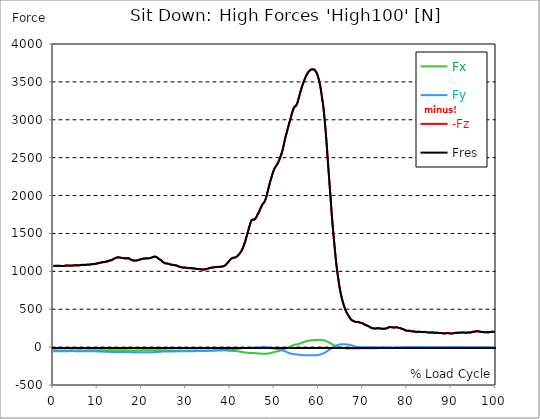
| Category |  Fx |  Fy |  -Fz |  Fres |
|---|---|---|---|---|
| 0.0 | -42.842 | -54.242 | 1071.949 | 1074.218 |
| 0.167348456675344 | -42.973 | -54.182 | 1071.723 | 1073.979 |
| 0.334696913350688 | -42.902 | -54.159 | 1071.03 | 1073.286 |
| 0.5020453700260321 | -42.735 | -54.099 | 1070.553 | 1072.797 |
| 0.669393826701376 | -42.389 | -54.003 | 1070.493 | 1072.725 |
| 0.83674228337672 | -42.902 | -53.765 | 1072.2 | 1074.432 |
| 1.0040907400520642 | -43.594 | -53.908 | 1072.546 | 1074.814 |
| 1.1621420602454444 | -43.188 | -54.194 | 1070.887 | 1073.167 |
| 1.3294905169207885 | -43.367 | -54.23 | 1070.35 | 1072.63 |
| 1.4968389735961325 | -43.415 | -54.051 | 1070.171 | 1072.451 |
| 1.6641874302714765 | -43.463 | -54.075 | 1070.242 | 1072.511 |
| 1.8315358869468206 | -43.451 | -54.361 | 1070.004 | 1072.296 |
| 1.9988843436221646 | -43.153 | -54.648 | 1068.738 | 1071.03 |
| 2.1662328002975086 | -43.069 | -54.445 | 1068.774 | 1071.054 |
| 2.333581256972853 | -43.033 | -54.182 | 1068.965 | 1071.221 |
| 2.5009297136481967 | -43.069 | -53.896 | 1070.875 | 1073.119 |
| 2.6682781703235405 | -43.105 | -53.609 | 1072.809 | 1075.041 |
| 2.8356266269988843 | -43.379 | -53.538 | 1074.492 | 1076.724 |
| 3.002975083674229 | -43.773 | -53.562 | 1076.056 | 1078.3 |
| 3.1703235403495724 | -43.69 | -53.538 | 1076.366 | 1078.61 |
| 3.337671997024917 | -43.391 | -53.526 | 1075.471 | 1077.703 |
| 3.4957233172182973 | -43.308 | -53.323 | 1074.671 | 1076.891 |
| 3.663071773893641 | -43.176 | -53.275 | 1073.907 | 1076.116 |
| 3.8304202305689854 | -42.938 | -53.156 | 1073.263 | 1075.459 |
| 3.997768687244329 | -42.699 | -52.929 | 1072.845 | 1075.017 |
| 4.165117143919673 | -42.627 | -52.81 | 1072.988 | 1075.161 |
| 4.332465600595017 | -42.747 | -52.834 | 1073.907 | 1076.08 |
| 4.499814057270361 | -42.95 | -52.893 | 1075.125 | 1077.309 |
| 4.667162513945706 | -43.32 | -53.013 | 1077.118 | 1079.315 |
| 4.834510970621049 | -43.69 | -53.132 | 1079.112 | 1081.332 |
| 5.001859427296393 | -43.785 | -53.323 | 1079.828 | 1082.06 |
| 5.169207883971737 | -43.642 | -53.597 | 1078.921 | 1081.153 |
| 5.336556340647081 | -43.081 | -53.717 | 1077.166 | 1079.386 |
| 5.503904797322425 | -42.532 | -53.717 | 1076.092 | 1078.3 |
| 5.671253253997769 | -42.508 | -53.777 | 1076.844 | 1079.052 |
| 5.82930457419115 | -42.424 | -53.729 | 1077.799 | 1079.995 |
| 5.996653030866494 | -42.389 | -53.633 | 1079.004 | 1081.189 |
| 6.164001487541838 | -42.651 | -53.311 | 1081.439 | 1083.624 |
| 6.331349944217181 | -43.188 | -53.287 | 1083.6 | 1085.796 |
| 6.498698400892526 | -43.355 | -53.777 | 1083.576 | 1085.796 |
| 6.66604685756787 | -43.045 | -54.063 | 1082.49 | 1084.71 |
| 6.833395314243213 | -43.308 | -53.956 | 1083.588 | 1085.82 |
| 7.000743770918558 | -43.726 | -54.123 | 1084.627 | 1086.883 |
| 7.168092227593902 | -43.212 | -54.588 | 1083.6 | 1085.856 |
| 7.335440684269246 | -42.532 | -54.755 | 1082.896 | 1085.14 |
| 7.50278914094459 | -42.591 | -54.445 | 1085.056 | 1087.277 |
| 7.6701375976199335 | -43.236 | -54.302 | 1087.062 | 1089.306 |
| 7.837486054295278 | -42.985 | -54.469 | 1086.763 | 1088.996 |
| 7.995537374488658 | -42.078 | -54.517 | 1085.94 | 1088.148 |
| 8.162885831164003 | -41.672 | -54.338 | 1087.384 | 1089.557 |
| 8.330234287839346 | -42.066 | -54.254 | 1091.097 | 1093.281 |
| 8.49758274451469 | -42.484 | -54.278 | 1092.386 | 1094.582 |
| 8.664931201190035 | -41.851 | -54.541 | 1091.705 | 1093.89 |
| 8.832279657865378 | -40.92 | -54.815 | 1091.419 | 1093.579 |
| 8.999628114540721 | -40.801 | -54.875 | 1093.174 | 1095.334 |
| 9.166976571216066 | -41.756 | -54.911 | 1096.325 | 1098.521 |
| 9.334325027891412 | -42.102 | -55.34 | 1097.805 | 1100.037 |
| 9.501673484566755 | -41.493 | -55.901 | 1098.092 | 1100.336 |
| 9.669021941242098 | -41.016 | -56.188 | 1098.951 | 1101.183 |
| 9.836370397917442 | -41.266 | -56.271 | 1101.374 | 1103.619 |
| 10.003718854592787 | -41.887 | -56.474 | 1104.335 | 1106.615 |
| 10.17106731126813 | -42.436 | -57.011 | 1106.352 | 1108.668 |
| 10.329118631461512 | -42.52 | -57.716 | 1107.343 | 1109.706 |
| 10.496467088136853 | -41.947 | -58.36 | 1108.692 | 1111.079 |
| 10.663815544812199 | -41.804 | -58.635 | 1112.583 | 1114.971 |
| 10.831164001487544 | -41.995 | -58.814 | 1116.666 | 1119.065 |
| 10.998512458162887 | -41.959 | -59.447 | 1118.277 | 1120.712 |
| 11.16586091483823 | -41.434 | -59.757 | 1118.588 | 1121.035 |
| 11.333209371513574 | -41.314 | -60.091 | 1120.092 | 1122.539 |
| 11.50055782818892 | -41.374 | -60.282 | 1119.781 | 1122.252 |
| 11.667906284864264 | -41.04 | -59.936 | 1121.942 | 1124.377 |
| 11.835254741539607 | -41.517 | -59.864 | 1125.416 | 1127.851 |
| 12.00260319821495 | -41.923 | -60.593 | 1128.269 | 1130.763 |
| 12.169951654890292 | -41.302 | -61.404 | 1128.352 | 1130.871 |
| 12.337300111565641 | -40.741 | -61.798 | 1130.549 | 1133.067 |
| 12.504648568240984 | -41.064 | -62.097 | 1136.171 | 1138.714 |
| 12.662699888434362 | -41.362 | -62.67 | 1140.826 | 1143.405 |
| 12.830048345109708 | -41.446 | -63.159 | 1142.76 | 1145.374 |
| 12.997396801785053 | -40.765 | -63.219 | 1143.13 | 1145.721 |
| 13.164745258460396 | -40.693 | -63.314 | 1147.165 | 1149.755 |
| 13.33209371513574 | -40.67 | -63.804 | 1150.113 | 1152.728 |
| 13.499442171811083 | -40.491 | -64.293 | 1155.437 | 1158.075 |
| 13.666790628486426 | -40.121 | -64.651 | 1162.874 | 1165.5 |
| 13.834139085161771 | -40.419 | -64.842 | 1169.463 | 1172.102 |
| 14.001487541837117 | -40.443 | -65.403 | 1172.77 | 1175.432 |
| 14.16883599851246 | -40.204 | -65.928 | 1176.184 | 1178.858 |
| 14.336184455187803 | -40.252 | -66.322 | 1179.562 | 1182.26 |
| 14.503532911863147 | -40.932 | -66.227 | 1183.131 | 1185.853 |
| 14.670881368538492 | -41.255 | -65.976 | 1184.23 | 1186.951 |
| 14.828932688731873 | -41.04 | -65.833 | 1183.215 | 1185.925 |
| 14.996281145407215 | -41.195 | -65.702 | 1180.207 | 1182.917 |
| 15.163629602082558 | -41.099 | -65.714 | 1179.109 | 1181.818 |
| 15.330978058757903 | -41.231 | -65.928 | 1176.387 | 1179.109 |
| 15.498326515433247 | -40.825 | -65.773 | 1173.498 | 1176.22 |
| 15.665674972108594 | -41.362 | -65.117 | 1174.286 | 1176.996 |
| 15.833023428783937 | -41.923 | -65.057 | 1174.74 | 1177.461 |
| 16.00037188545928 | -42.102 | -65.344 | 1172.782 | 1175.527 |
| 16.167720342134626 | -42.066 | -65.499 | 1170.096 | 1172.854 |
| 16.335068798809967 | -41.648 | -65.332 | 1168.258 | 1171.003 |
| 16.502417255485312 | -41.971 | -64.854 | 1169.678 | 1172.4 |
| 16.669765712160658 | -42.723 | -64.806 | 1171.242 | 1173.976 |
| 16.837114168836 | -43.176 | -64.866 | 1171.003 | 1173.773 |
| 17.004462625511344 | -43.737 | -64.806 | 1170.538 | 1173.331 |
| 17.16251394570472 | -44 | -65.403 | 1166.014 | 1168.843 |
| 17.32986240238007 | -43.666 | -66.036 | 1159.544 | 1162.397 |
| 17.497210859055414 | -43.332 | -66.657 | 1153.038 | 1155.927 |
| 17.664559315730756 | -43.153 | -67.051 | 1148.454 | 1151.343 |
| 17.8319077724061 | -44.119 | -67.039 | 1144.587 | 1147.523 |
| 17.999256229081443 | -44.657 | -67.098 | 1141.758 | 1144.73 |
| 18.166604685756788 | -44.692 | -67.194 | 1142.211 | 1145.195 |
| 18.333953142432133 | -44.824 | -67.158 | 1141.125 | 1144.121 |
| 18.501301599107478 | -44.609 | -66.848 | 1140.444 | 1143.405 |
| 18.668650055782823 | -44.549 | -66.669 | 1140.421 | 1143.381 |
| 18.835998512458165 | -44.489 | -66.573 | 1141.59 | 1144.527 |
| 19.00334696913351 | -44.072 | -66.633 | 1143.691 | 1146.616 |
| 19.170695425808855 | -43.511 | -67.039 | 1145.744 | 1148.669 |
| 19.338043882484197 | -43.033 | -67.397 | 1148.084 | 1150.997 |
| 19.496095202677576 | -43.153 | -67.444 | 1152.728 | 1155.64 |
| 19.66344365935292 | -43.451 | -67.624 | 1156.213 | 1159.138 |
| 19.830792116028263 | -42.878 | -68.089 | 1157.944 | 1160.869 |
| 19.998140572703612 | -42.162 | -67.91 | 1159.902 | 1162.767 |
| 20.165489029378953 | -42.114 | -67.612 | 1163.519 | 1166.36 |
| 20.3328374860543 | -42.054 | -67.516 | 1166.599 | 1169.44 |
| 20.500185942729644 | -41.648 | -67.576 | 1168.628 | 1171.457 |
| 20.667534399404985 | -41.207 | -68.041 | 1167.494 | 1170.335 |
| 20.83488285608033 | -40.789 | -68.256 | 1167.864 | 1170.681 |
| 21.002231312755672 | -40.944 | -68.101 | 1170.872 | 1173.689 |
| 21.16957976943102 | -41.243 | -68.149 | 1172.149 | 1174.978 |
| 21.336928226106362 | -41.099 | -68.626 | 1170.788 | 1173.641 |
| 21.504276682781704 | -40.67 | -68.841 | 1168.831 | 1171.684 |
| 21.67162513945705 | -40.586 | -68.495 | 1169.965 | 1172.794 |
| 21.82967645965043 | -41.147 | -68.089 | 1172.866 | 1175.683 |
| 21.997024916325774 | -41.29 | -68.185 | 1174.501 | 1177.306 |
| 22.16437337300112 | -41.911 | -67.958 | 1177.091 | 1179.908 |
| 22.33172182967646 | -42.257 | -67.588 | 1181.89 | 1184.695 |
| 22.499070286351806 | -42.257 | -67.242 | 1187.381 | 1190.162 |
| 22.666418743027148 | -41.839 | -66.645 | 1190.747 | 1193.481 |
| 22.833767199702496 | -41.625 | -66.525 | 1191.607 | 1194.328 |
| 23.00111565637784 | -41.828 | -65.487 | 1191.989 | 1194.675 |
| 23.168464113053183 | -41.851 | -64.639 | 1191.046 | 1193.708 |
| 23.335812569728528 | -41.66 | -64.102 | 1186.641 | 1189.291 |
| 23.50316102640387 | -41.505 | -63.457 | 1180.78 | 1183.418 |
| 23.670509483079215 | -41.183 | -62.503 | 1170.418 | 1173.009 |
| 23.83785793975456 | -40.622 | -62.025 | 1163.041 | 1165.596 |
| 23.995909259947936 | -41.111 | -61.261 | 1157.228 | 1159.782 |
| 24.163257716623285 | -41.911 | -60.927 | 1153.623 | 1156.201 |
| 24.330606173298627 | -42.007 | -60.473 | 1147.26 | 1149.851 |
| 24.49795462997397 | -41.72 | -59.697 | 1136.064 | 1138.63 |
| 24.665303086649313 | -41.529 | -58.862 | 1124.962 | 1127.505 |
| 24.83265154332466 | -41.684 | -58.181 | 1118.146 | 1120.665 |
| 25.0 | -42.186 | -57.859 | 1113.347 | 1115.866 |
| 25.167348456675345 | -42.472 | -57.728 | 1107.104 | 1109.635 |
| 25.334696913350694 | -42.544 | -57.835 | 1102.867 | 1105.409 |
| 25.502045370026035 | -42.89 | -57.573 | 1101.732 | 1104.275 |
| 25.669393826701377 | -43.033 | -57.656 | 1101.828 | 1104.383 |
| 25.836742283376722 | -43.332 | -57.632 | 1101.1 | 1103.678 |
| 26.004090740052067 | -43.32 | -57.584 | 1098.653 | 1101.219 |
| 26.17143919672741 | -43.176 | -57.68 | 1094.2 | 1096.767 |
| 26.329490516920792 | -43.069 | -57.644 | 1090.165 | 1092.744 |
| 26.49683897359613 | -42.997 | -57.167 | 1088.196 | 1090.75 |
| 26.66418743027148 | -43.117 | -56.856 | 1086.919 | 1089.461 |
| 26.831535886946828 | -43.272 | -56.653 | 1085.737 | 1088.267 |
| 26.998884343622166 | -43.487 | -56.224 | 1084.161 | 1086.692 |
| 27.166232800297514 | -43.594 | -56.08 | 1081.774 | 1084.304 |
| 27.333581256972852 | -43.511 | -56.188 | 1079.923 | 1082.466 |
| 27.5009297136482 | -43.749 | -56.355 | 1078.968 | 1081.535 |
| 27.668278170323543 | -43.94 | -56.45 | 1077.679 | 1080.246 |
| 27.835626626998888 | -43.881 | -56.379 | 1075.232 | 1077.799 |
| 28.002975083674233 | -43.833 | -56.248 | 1072.057 | 1074.611 |
| 28.170323540349575 | -43.797 | -56.045 | 1068.118 | 1070.672 |
| 28.33767199702492 | -43.403 | -55.866 | 1062.913 | 1065.444 |
| 28.50502045370026 | -43.355 | -55.436 | 1059.248 | 1061.755 |
| 28.663071773893645 | -43.69 | -55.042 | 1056.694 | 1059.201 |
| 28.830420230568986 | -43.785 | -55.018 | 1053.829 | 1056.336 |
| 28.99776868724433 | -43.714 | -54.97 | 1051.298 | 1053.805 |
| 29.165117143919673 | -43.511 | -54.887 | 1049.018 | 1051.525 |
| 29.33246560059502 | -43.487 | -54.803 | 1048.087 | 1050.582 |
| 29.499814057270367 | -43.546 | -54.66 | 1047.693 | 1050.188 |
| 29.66716251394571 | -43.666 | -54.397 | 1047.419 | 1049.902 |
| 29.834510970621054 | -43.821 | -54.302 | 1046.917 | 1049.412 |
| 30.00185942729639 | -43.964 | -54.242 | 1046.368 | 1048.863 |
| 30.169207883971744 | -44.012 | -54.314 | 1044.303 | 1046.822 |
| 30.33655634064708 | -44.036 | -54.338 | 1042.441 | 1044.96 |
| 30.50390479732243 | -44.06 | -54.266 | 1041.307 | 1043.826 |
| 30.671253253997772 | -44.155 | -54.159 | 1040.782 | 1043.289 |
| 30.829304574191156 | -44.37 | -53.968 | 1041.08 | 1043.587 |
| 30.996653030866494 | -44.573 | -53.788 | 1041.391 | 1043.885 |
| 31.164001487541842 | -44.836 | -53.586 | 1040.089 | 1042.584 |
| 31.331349944217187 | -45.074 | -53.395 | 1038.752 | 1041.259 |
| 31.498698400892525 | -45.11 | -53.418 | 1038.203 | 1040.71 |
| 31.666046857567874 | -45.146 | -53.442 | 1037.654 | 1040.161 |
| 31.833395314243212 | -45.146 | -53.43 | 1036.831 | 1039.337 |
| 32.00074377091856 | -45.051 | -53.251 | 1035.04 | 1037.535 |
| 32.1680922275939 | -44.955 | -53.072 | 1033.249 | 1035.732 |
| 32.33544068426925 | -44.883 | -52.786 | 1031.34 | 1033.811 |
| 32.50278914094459 | -44.883 | -52.344 | 1029.274 | 1031.71 |
| 32.670137597619934 | -45.218 | -51.986 | 1028.952 | 1031.387 |
| 32.83748605429528 | -45.552 | -51.64 | 1028.63 | 1031.077 |
| 33.004834510970625 | -45.85 | -51.329 | 1028.128 | 1030.576 |
| 33.162885831164004 | -45.994 | -51.306 | 1026.648 | 1029.107 |
| 33.33023428783935 | -46.125 | -51.27 | 1025.18 | 1027.627 |
| 33.497582744514695 | -46.256 | -51.246 | 1023.7 | 1026.159 |
| 33.664931201190036 | -46.185 | -51.174 | 1022.948 | 1025.395 |
| 33.83227965786538 | -45.982 | -51.091 | 1022.578 | 1025.013 |
| 33.99962811454073 | -45.791 | -51.007 | 1022.208 | 1024.631 |
| 34.16697657121607 | -45.6 | -50.84 | 1022.852 | 1025.24 |
| 34.33432502789141 | -45.409 | -50.565 | 1025.311 | 1027.675 |
| 34.50167348456676 | -45.206 | -50.279 | 1027.77 | 1030.098 |
| 34.6690219412421 | -45.373 | -49.825 | 1030.158 | 1032.462 |
| 34.83637039791744 | -45.707 | -49.288 | 1032.509 | 1034.789 |
| 35.00371885459279 | -45.91 | -48.835 | 1035.398 | 1037.654 |
| 35.17106731126814 | -45.934 | -48.476 | 1039.063 | 1041.283 |
| 35.338415767943474 | -45.898 | -48.083 | 1042.083 | 1044.267 |
| 35.49646708813686 | -45.791 | -47.677 | 1044.626 | 1046.774 |
| 35.6638155448122 | -45.492 | -47.295 | 1046.834 | 1048.947 |
| 35.831164001487544 | -44.943 | -46.817 | 1047.944 | 1050.009 |
| 35.998512458162885 | -44.394 | -46.34 | 1049.078 | 1051.083 |
| 36.165860914838234 | -43.869 | -45.922 | 1050.618 | 1052.588 |
| 36.333209371513576 | -43.523 | -45.54 | 1051.812 | 1053.745 |
| 36.50055782818892 | -43.32 | -45.182 | 1052.802 | 1054.712 |
| 36.667906284864266 | -43.093 | -44.8 | 1054.426 | 1056.3 |
| 36.83525474153961 | -42.759 | -44.466 | 1055.154 | 1057.004 |
| 37.002603198214956 | -42.759 | -43.869 | 1056.324 | 1058.138 |
| 37.1699516548903 | -42.782 | -43.248 | 1057.529 | 1059.308 |
| 37.337300111565646 | -42.794 | -42.735 | 1058.162 | 1059.917 |
| 37.50464856824098 | -42.818 | -42.245 | 1058.664 | 1060.394 |
| 37.66269988843437 | -42.568 | -41.696 | 1059.177 | 1060.872 |
| 37.83004834510971 | -42.269 | -41.123 | 1059.547 | 1061.218 |
| 37.99739680178505 | -42.186 | -40.491 | 1060.836 | 1062.471 |
| 38.16474525846039 | -42.257 | -39.87 | 1062.937 | 1064.548 |
| 38.33209371513574 | -42.233 | -39.786 | 1064.035 | 1065.635 |
| 38.49944217181109 | -42.221 | -39.774 | 1065.229 | 1066.828 |
| 38.666790628486424 | -42.735 | -39.488 | 1070.051 | 1071.663 |
| 38.83413908516178 | -43.427 | -39.13 | 1076.832 | 1078.443 |
| 39.001487541837115 | -44.418 | -38.354 | 1086.393 | 1088.017 |
| 39.16883599851246 | -45.456 | -37.268 | 1096.194 | 1097.817 |
| 39.336184455187805 | -46.137 | -36.551 | 1107.379 | 1109.002 |
| 39.503532911863154 | -46.829 | -35.692 | 1118.444 | 1120.044 |
| 39.670881368538495 | -47.617 | -34.606 | 1129.749 | 1131.348 |
| 39.83822982521384 | -48.285 | -34.188 | 1141.817 | 1143.417 |
| 39.996281145407224 | -48.715 | -33.185 | 1154.423 | 1155.998 |
| 40.163629602082565 | -49.408 | -32.003 | 1163.853 | 1165.417 |
| 40.33097805875791 | -50.112 | -30.917 | 1170.323 | 1171.863 |
| 40.498326515433256 | -50.53 | -29.879 | 1175.432 | 1176.96 |
| 40.6656749721086 | -50.804 | -28.816 | 1178.81 | 1180.326 |
| 40.83302342878393 | -51.055 | -27.778 | 1178.213 | 1179.705 |
| 41.00037188545929 | -51.926 | -26.739 | 1179.717 | 1181.221 |
| 41.16772034213463 | -52.869 | -25.402 | 1183.872 | 1185.399 |
| 41.33506879880997 | -53.192 | -24.877 | 1187.572 | 1189.112 |
| 41.50241725548531 | -54.123 | -23.826 | 1194.603 | 1196.167 |
| 41.66976571216066 | -55.304 | -22.728 | 1203.066 | 1204.666 |
| 41.837114168836 | -56.94 | -21.32 | 1213.607 | 1215.254 |
| 42.004462625511344 | -58.396 | -20.114 | 1224.577 | 1226.272 |
| 42.17181108218669 | -59.578 | -19.004 | 1236.383 | 1238.09 |
| 42.32986240238007 | -60.7 | -17.44 | 1251.555 | 1253.274 |
| 42.497210859055414 | -61.81 | -15.709 | 1266.178 | 1267.897 |
| 42.66455931573076 | -63.243 | -14.324 | 1283.773 | 1285.516 |
| 42.831907772406105 | -65.32 | -13.19 | 1305.522 | 1307.337 |
| 42.999256229081446 | -67.564 | -12.355 | 1331.617 | 1333.503 |
| 43.16660468575679 | -69.474 | -11.579 | 1359.549 | 1361.483 |
| 43.33395314243214 | -70.894 | -10.863 | 1386.444 | 1388.413 |
| 43.50130159910748 | -72.458 | -10.6 | 1419.497 | 1421.503 |
| 43.66865005578282 | -73.902 | -10.696 | 1453.888 | 1455.929 |
| 43.83599851245817 | -74.75 | -10.147 | 1488.553 | 1490.571 |
| 44.00334696913351 | -75.765 | -9.86 | 1520.318 | 1522.359 |
| 44.17069542580886 | -76.779 | -9.956 | 1557.263 | 1559.305 |
| 44.3380438824842 | -77.412 | -10.015 | 1593.647 | 1595.665 |
| 44.49609520267758 | -77.567 | -9.86 | 1623.717 | 1625.699 |
| 44.66344365935292 | -77.221 | -9.347 | 1653.261 | 1655.195 |
| 44.83079211602827 | -77.173 | -9.168 | 1673.745 | 1675.655 |
| 44.99814057270361 | -77.854 | -9.132 | 1683.737 | 1685.658 |
| 45.16548902937895 | -77.997 | -8.738 | 1682.985 | 1684.906 |
| 45.332837486054295 | -78.51 | -8.058 | 1680 | 1681.934 |
| 45.500185942729644 | -79.131 | -7.926 | 1683.152 | 1685.097 |
| 45.66753439940499 | -79.799 | -7.974 | 1690.529 | 1692.498 |
| 45.83488285608033 | -80.265 | -8.046 | 1708.411 | 1710.392 |
| 46.00223131275568 | -81.841 | -8.702 | 1728.071 | 1730.1 |
| 46.16957976943102 | -83.034 | -8.153 | 1748.089 | 1750.166 |
| 46.336928226106366 | -84.359 | -6.828 | 1762.056 | 1764.181 |
| 46.50427668278171 | -85.398 | -4.846 | 1780.475 | 1782.659 |
| 46.671625139457056 | -85.828 | -2.829 | 1806.39 | 1808.598 |
| 46.829676459650436 | -86.066 | -0.645 | 1828.915 | 1831.183 |
| 46.99702491632577 | -86.401 | 1.707 | 1848.313 | 1850.641 |
| 47.16437337300112 | -86.472 | 3.689 | 1868.893 | 1871.256 |
| 47.33172182967646 | -86.532 | 4.488 | 1887.491 | 1889.866 |
| 47.49907028635181 | -86.83 | 4.811 | 1897.589 | 1899.965 |
| 47.66641874302716 | -87.26 | 4.846 | 1908.058 | 1910.41 |
| 47.83376719970249 | -87.702 | 3.474 | 1929.008 | 1931.335 |
| 48.001115656377834 | -87.929 | 1.564 | 1952.774 | 1955.042 |
| 48.16846411305319 | -87.726 | -0.585 | 1985.387 | 1987.607 |
| 48.33581256972853 | -86.365 | -2.196 | 2022.606 | 2024.719 |
| 48.50316102640387 | -84.658 | -3.712 | 2060.435 | 2062.416 |
| 48.67050948307921 | -82.712 | -5.455 | 2100.544 | 2102.43 |
| 48.837857939754564 | -81.482 | -7.556 | 2140.545 | 2142.383 |
| 49.005206396429905 | -80.217 | -10.66 | 2177.036 | 2178.791 |
| 49.163257716623285 | -78.259 | -13.501 | 2209.923 | 2211.558 |
| 49.33060617329863 | -75.884 | -16.115 | 2240.888 | 2242.392 |
| 49.49795462997397 | -72.84 | -17.75 | 2277.069 | 2278.478 |
| 49.66530308664932 | -69.199 | -18.717 | 2306.195 | 2307.497 |
| 49.832651543324666 | -66.072 | -19.469 | 2331.777 | 2332.982 |
| 50.0 | -63.469 | -20.209 | 2356.761 | 2357.907 |
| 50.16734845667534 | -61.607 | -20.639 | 2373.139 | 2374.237 |
| 50.33469691335069 | -59.924 | -21.021 | 2386.15 | 2387.2 |
| 50.50204537002604 | -58.098 | -22.191 | 2401.238 | 2402.229 |
| 50.66939382670139 | -55.782 | -23.791 | 2418.428 | 2419.359 |
| 50.836742283376715 | -52.941 | -25.844 | 2437.897 | 2438.745 |
| 51.00409074005207 | -50.303 | -28.076 | 2458.799 | 2459.599 |
| 51.17143919672741 | -47.772 | -30.69 | 2483.031 | 2483.795 |
| 51.32949051692079 | -45.015 | -33.77 | 2511.167 | 2511.895 |
| 51.496838973596134 | -41.469 | -37.912 | 2538.061 | 2538.766 |
| 51.66418743027148 | -38.103 | -41.577 | 2567.164 | 2567.844 |
| 51.831535886946824 | -35.035 | -44.489 | 2601.268 | 2601.937 |
| 51.99888434362217 | -31.944 | -47.665 | 2643.131 | 2643.8 |
| 52.16623280029752 | -27.873 | -51.091 | 2688.803 | 2689.483 |
| 52.33358125697285 | -23.086 | -54.505 | 2734.366 | 2735.083 |
| 52.5009297136482 | -18.574 | -58.122 | 2772.696 | 2773.425 |
| 52.668278170323546 | -14.074 | -61.858 | 2808.937 | 2809.701 |
| 52.835626626998895 | -9.776 | -65.809 | 2845.202 | 2846.026 |
| 53.00297508367424 | -5.957 | -70.106 | 2882.207 | 2883.102 |
| 53.17032354034958 | -1.934 | -74.416 | 2919.893 | 2920.895 |
| 53.33767199702492 | 2.555 | -78.224 | 2957.136 | 2958.222 |
| 53.50502045370027 | 6.685 | -81.888 | 2988.555 | 2989.736 |
| 53.663071773893655 | 10.994 | -85.052 | 3023.22 | 3024.497 |
| 53.83042023056899 | 15.315 | -87.332 | 3059.031 | 3060.38 |
| 53.99776868724433 | 19.648 | -89.23 | 3092.825 | 3094.245 |
| 54.16511714391967 | 23.826 | -90.889 | 3123.455 | 3124.924 |
| 54.33246560059503 | 27.813 | -92.488 | 3150.374 | 3151.913 |
| 54.49981405727037 | 31.371 | -93.324 | 3169.174 | 3170.75 |
| 54.667162513945705 | 33.997 | -94.088 | 3177.113 | 3178.736 |
| 54.834510970621054 | 34.164 | -94.912 | 3182.317 | 3183.965 |
| 55.0018594272964 | 34.558 | -95.855 | 3191.043 | 3192.714 |
| 55.169207883971744 | 36.253 | -97.418 | 3219.071 | 3220.802 |
| 55.336556340647086 | 39.273 | -98.612 | 3254.871 | 3256.649 |
| 55.50390479732243 | 42.496 | -100.773 | 3289.464 | 3291.327 |
| 55.671253253997776 | 46.125 | -102.134 | 3326.625 | 3328.558 |
| 55.83860171067312 | 49.252 | -103.005 | 3362.77 | 3364.752 |
| 55.9966530308665 | 52.583 | -103.948 | 3394.021 | 3396.062 |
| 56.16400148754184 | 56.51 | -104.987 | 3427.803 | 3429.916 |
| 56.33134994421718 | 60.27 | -105.858 | 3456.058 | 3458.243 |
| 56.498698400892536 | 64.293 | -106.395 | 3484.552 | 3486.808 |
| 56.66604685756788 | 67.624 | -106.956 | 3510.324 | 3512.628 |
| 56.83339531424321 | 70.572 | -106.992 | 3534.067 | 3536.419 |
| 57.00074377091856 | 73.688 | -107.016 | 3558.299 | 3560.699 |
| 57.16809222759391 | 76.588 | -107.529 | 3580.383 | 3582.842 |
| 57.33544068426925 | 78.928 | -108.21 | 3598.336 | 3600.855 |
| 57.5027891409446 | 81.268 | -108.842 | 3615.92 | 3618.498 |
| 57.670137597619934 | 83.44 | -109.379 | 3630.447 | 3633.085 |
| 57.83748605429528 | 85.362 | -109.535 | 3641.763 | 3644.437 |
| 58.004834510970625 | 87.069 | -108.615 | 3649.296 | 3651.981 |
| 58.16288583116401 | 88.442 | -107.983 | 3657.496 | 3660.182 |
| 58.330234287839346 | 89.91 | -107.66 | 3663.131 | 3665.84 |
| 58.497582744514695 | 91.665 | -107.923 | 3664.36 | 3667.13 |
| 58.66493120119004 | 91.927 | -107.935 | 3663.429 | 3666.199 |
| 58.832279657865385 | 92.393 | -108.019 | 3661.949 | 3664.742 |
| 58.999628114540734 | 93.002 | -108.066 | 3660.17 | 3662.987 |
| 59.16697657121607 | 93.551 | -107.959 | 3651.504 | 3654.333 |
| 59.33432502789142 | 94.303 | -107.744 | 3638.039 | 3640.892 |
| 59.50167348456676 | 94.78 | -107.004 | 3620.265 | 3623.118 |
| 59.66902194124211 | 95.282 | -105.655 | 3597.656 | 3600.497 |
| 59.83637039791745 | 95.735 | -103.912 | 3569.425 | 3572.254 |
| 60.00371885459278 | 95.998 | -101.704 | 3534.759 | 3537.553 |
| 60.17106731126813 | 95.64 | -98.958 | 3494.376 | 3497.11 |
| 60.33841576794349 | 95.616 | -96.404 | 3448.084 | 3450.782 |
| 60.49646708813685 | 95.294 | -93.241 | 3390.046 | 3392.696 |
| 60.6638155448122 | 94.398 | -89.898 | 3324.547 | 3327.138 |
| 60.831164001487544 | 93.384 | -86.603 | 3255.491 | 3258.01 |
| 60.99851245816289 | 91.892 | -83.357 | 3191.568 | 3194.016 |
| 61.16586091483824 | 89.982 | -78.785 | 3104.285 | 3106.624 |
| 61.333209371513576 | 87.642 | -73.592 | 3004.479 | 3006.699 |
| 61.50055782818892 | 84.825 | -68.34 | 2895.445 | 2897.546 |
| 61.667906284864266 | 80.969 | -62.634 | 2775.167 | 2777.113 |
| 61.835254741539615 | 76.445 | -56.379 | 2647.93 | 2649.697 |
| 62.002603198214956 | 71.67 | -49.491 | 2509.949 | 2511.525 |
| 62.16995165489029 | 66.764 | -42.747 | 2373.986 | 2375.383 |
| 62.33730011156564 | 61.512 | -36.265 | 2239.24 | 2240.458 |
| 62.504648568240995 | 56.152 | -30.093 | 2106.799 | 2107.825 |
| 62.67199702491633 | 50.983 | -24.602 | 1982.51 | 1983.405 |
| 62.83004834510971 | 44.191 | -17.762 | 1835.266 | 1835.982 |
| 62.99739680178505 | 38.163 | -11.555 | 1708.446 | 1709.031 |
| 63.1647452584604 | 32.779 | -5.694 | 1593.134 | 1593.6 |
| 63.33209371513575 | 27.849 | -0.477 | 1487.276 | 1487.67 |
| 63.4994421718111 | 23.122 | 5.252 | 1379.15 | 1379.484 |
| 63.666790628486424 | 18.359 | 10.457 | 1277.112 | 1277.422 |
| 63.83413908516177 | 13.274 | 15.518 | 1175.42 | 1175.754 |
| 64.00148754183712 | 9.681 | 20.926 | 1086.513 | 1086.895 |
| 64.16883599851248 | 6.446 | 24.698 | 1009.626 | 1010.068 |
| 64.3361844551878 | 3.068 | 27.801 | 936.428 | 936.965 |
| 64.50353291186315 | 0.346 | 30.833 | 871.251 | 871.92 |
| 64.6708813685385 | -2.316 | 33.973 | 803.771 | 804.631 |
| 64.83822982521384 | -4.751 | 35.931 | 750.938 | 751.94 |
| 65.00557828188919 | -6.935 | 37.459 | 700.086 | 701.267 |
| 65.16362960208257 | -8.821 | 38.175 | 658.628 | 659.917 |
| 65.3309780587579 | -10.54 | 38.736 | 618.925 | 620.346 |
| 65.49832651543326 | -11.997 | 38.927 | 584.642 | 586.17 |
| 65.6656749721086 | -13.202 | 38.736 | 553.2 | 554.823 |
| 65.83302342878395 | -14.527 | 38.33 | 522.581 | 524.324 |
| 66.00037188545929 | -15.757 | 37.59 | 496.32 | 498.146 |
| 66.16772034213463 | -16.963 | 36.778 | 473.114 | 475.024 |
| 66.33506879880998 | -18.061 | 35.608 | 453.108 | 455.053 |
| 66.50241725548531 | -18.598 | 34.116 | 436.014 | 437.936 |
| 66.66976571216065 | -18.98 | 32.361 | 419.887 | 421.761 |
| 66.83711416883601 | -19.326 | 30.547 | 404.619 | 406.457 |
| 67.00446262551135 | -19.445 | 28.721 | 388.385 | 390.187 |
| 67.1718110821867 | -18.825 | 26.154 | 372.902 | 374.538 |
| 67.32986240238007 | -18.598 | 23.671 | 362.565 | 364.069 |
| 67.49721085905541 | -18.455 | 20.95 | 354.615 | 355.952 |
| 67.66455931573076 | -18.717 | 18.67 | 348.945 | 350.174 |
| 67.83190777240611 | -18.335 | 16.545 | 344.003 | 345.125 |
| 67.99925622908145 | -17.619 | 13.549 | 338.285 | 339.24 |
| 68.16660468575678 | -17.476 | 10.719 | 334.537 | 335.42 |
| 68.33395314243214 | -17.607 | 8.105 | 332.316 | 333.128 |
| 68.50130159910749 | -17.595 | 6.148 | 331.684 | 332.46 |
| 68.66865005578282 | -17.75 | 4.381 | 332.149 | 332.913 |
| 68.83599851245816 | -17.774 | 2.996 | 332.376 | 333.14 |
| 69.00334696913352 | -17.368 | 1.862 | 330.048 | 330.8 |
| 69.17069542580886 | -17.058 | 1.015 | 326.527 | 327.279 |
| 69.3380438824842 | -16.521 | 0.215 | 322.635 | 323.399 |
| 69.50539233915956 | -16.079 | -0.74 | 319.77 | 320.534 |
| 69.66344365935292 | -16.187 | -1.218 | 318.565 | 319.329 |
| 69.83079211602826 | -16.175 | -1.432 | 315.855 | 316.631 |
| 69.99814057270362 | -15.841 | -1.397 | 310.185 | 310.961 |
| 70.16548902937896 | -15.53 | -1.062 | 304.658 | 305.434 |
| 70.33283748605429 | -14.945 | -1.683 | 297.567 | 298.319 |
| 70.50018594272964 | -14.79 | -2.113 | 292.912 | 293.628 |
| 70.667534399405 | -14.897 | -2.077 | 290.202 | 290.93 |
| 70.83488285608033 | -15.16 | -1.719 | 286.526 | 287.266 |
| 71.00223131275568 | -14.921 | -1.862 | 280.163 | 280.891 |
| 71.16957976943102 | -14.957 | -2.662 | 277.167 | 277.883 |
| 71.33692822610637 | -15.22 | -2.137 | 274.23 | 274.959 |
| 71.50427668278171 | -14.48 | -1.814 | 267.558 | 268.25 |
| 71.67162513945706 | -13.847 | -1.456 | 260.348 | 260.992 |
| 71.8389735961324 | -13.68 | -1.17 | 255.048 | 255.668 |
| 71.99702491632577 | -13.954 | -1.289 | 251.801 | 252.433 |
| 72.16437337300113 | -14.193 | -1.528 | 249.079 | 249.724 |
| 72.33172182967647 | -13.919 | -1.814 | 246.214 | 246.835 |
| 72.49907028635181 | -13.728 | -1.862 | 245.259 | 245.868 |
| 72.66641874302715 | -13.561 | -1.564 | 245.056 | 245.653 |
| 72.8337671997025 | -13.393 | -1.456 | 244.853 | 245.45 |
| 73.00111565637783 | -13.537 | -1.564 | 245.581 | 246.202 |
| 73.16846411305319 | -13.704 | -1.731 | 247.097 | 247.718 |
| 73.33581256972853 | -13.632 | -1.719 | 248.232 | 248.852 |
| 73.50316102640387 | -13.429 | -1.623 | 248.542 | 249.163 |
| 73.67050948307921 | -13.071 | -1.767 | 248.16 | 248.733 |
| 73.83785793975457 | -13.011 | -1.743 | 246.071 | 246.608 |
| 74.00520639642991 | -12.761 | -1.48 | 243.982 | 244.471 |
| 74.16325771662328 | -13.059 | -0.943 | 243.66 | 244.149 |
| 74.33060617329863 | -13.214 | -0.728 | 242.49 | 242.979 |
| 74.49795462997398 | -13.322 | -0.609 | 241.081 | 241.571 |
| 74.66530308664932 | -12.904 | -0.931 | 241.296 | 241.762 |
| 74.83265154332466 | -12.713 | -0.943 | 242.382 | 242.848 |
| 75.00000000000001 | -12.737 | -0.836 | 243.313 | 243.767 |
| 75.16734845667534 | -12.713 | -1.48 | 245.199 | 245.653 |
| 75.3346969133507 | -12.832 | -2.375 | 248.291 | 248.733 |
| 75.50204537002605 | -13.286 | -2.566 | 252.266 | 252.72 |
| 75.66939382670138 | -13.119 | -3.187 | 256.528 | 256.969 |
| 75.83674228337672 | -13.358 | -3.319 | 260.157 | 260.61 |
| 76.00409074005208 | -13.346 | -3.581 | 262.449 | 262.89 |
| 76.17143919672742 | -13.179 | -3.796 | 264.49 | 264.943 |
| 76.33878765340276 | -12.94 | -3.927 | 264.74 | 265.182 |
| 76.49683897359614 | -12.701 | -4.142 | 262.723 | 263.141 |
| 76.66418743027148 | -12.021 | -4.667 | 260.252 | 260.646 |
| 76.83153588694682 | -11.388 | -5.026 | 259.023 | 259.393 |
| 76.99888434362218 | -11.591 | -4.464 | 260.073 | 260.455 |
| 77.16623280029752 | -11.34 | -4.238 | 259.584 | 259.954 |
| 77.33358125697285 | -10.899 | -4.488 | 258.7 | 259.07 |
| 77.5009297136482 | -10.97 | -4.094 | 260.861 | 261.219 |
| 77.66827817032356 | -10.994 | -3.533 | 261.243 | 261.589 |
| 77.83562662699889 | -10.672 | -3.629 | 259.417 | 259.763 |
| 78.00297508367423 | -10.17 | -3.736 | 256.48 | 256.814 |
| 78.17032354034959 | -9.597 | -3.605 | 252.815 | 253.126 |
| 78.33767199702493 | -10.326 | -2.614 | 252.791 | 253.126 |
| 78.50502045370027 | -10.421 | -1.934 | 250.261 | 250.595 |
| 78.67236891037561 | -10.111 | -1.647 | 245.056 | 245.39 |
| 78.83042023056899 | -9.788 | -1.421 | 240.425 | 240.747 |
| 78.99776868724433 | -9.944 | -0.752 | 238.336 | 238.67 |
| 79.16511714391969 | -9.669 | -0.155 | 234.647 | 234.981 |
| 79.33246560059503 | -9.681 | 0.107 | 229.801 | 230.135 |
| 79.49981405727036 | -9.442 | 0.43 | 224.942 | 225.288 |
| 79.66716251394571 | -9.335 | 0.943 | 219.403 | 219.762 |
| 79.83451097062107 | -9.06 | 0.704 | 215.667 | 216.025 |
| 80.00185942729641 | -9.287 | 0.955 | 215.154 | 215.524 |
| 80.16920788397174 | -9.466 | 1.17 | 214.832 | 215.19 |
| 80.33655634064709 | -10.027 | 0.991 | 216.145 | 216.527 |
| 80.50390479732243 | -10.039 | 0.776 | 216.753 | 217.135 |
| 80.67125325399778 | -9.741 | 0.991 | 214.39 | 214.784 |
| 80.83860171067312 | -9.168 | 0.668 | 210.355 | 210.737 |
| 80.99665303086651 | -8.917 | 0.048 | 208.123 | 208.493 |
| 81.16400148754184 | -8.798 | -0.036 | 207.156 | 207.526 |
| 81.3313499442172 | -8.642 | -0.466 | 206.082 | 206.464 |
| 81.49869840089255 | -8.833 | -0.31 | 207.359 | 207.765 |
| 81.66604685756786 | -8.607 | -0.048 | 205.867 | 206.273 |
| 81.83339531424322 | -8.392 | 0.322 | 203.157 | 203.539 |
| 82.00074377091858 | -7.867 | 0.155 | 200.256 | 200.65 |
| 82.16809222759392 | -7.652 | -0.06 | 199.851 | 200.221 |
| 82.33544068426926 | -8.01 | -0.048 | 201.164 | 201.558 |
| 82.50278914094459 | -8.32 | 0.143 | 202.668 | 203.085 |
| 82.67013759761994 | -8.535 | 0.454 | 203.933 | 204.351 |
| 82.83748605429528 | -8.153 | 0.716 | 202.178 | 202.584 |
| 83.00483451097062 | -7.52 | 0.358 | 199.469 | 199.851 |
| 83.17218296764597 | -7.246 | 0.37 | 197.976 | 198.335 |
| 83.33023428783935 | -7.365 | 0.489 | 198.227 | 198.585 |
| 83.4975827445147 | -7.031 | 0.084 | 197.523 | 197.845 |
| 83.66493120119004 | -7.401 | 0.334 | 199.791 | 200.125 |
| 83.83227965786537 | -7.64 | 0.418 | 200.937 | 201.283 |
| 83.99962811454073 | -7.628 | 0.167 | 201.068 | 201.402 |
| 84.16697657121607 | -7.222 | -0.203 | 199.528 | 199.851 |
| 84.33432502789142 | -6.792 | -0.489 | 197.535 | 197.845 |
| 84.50167348456677 | -6.422 | -0.943 | 195.303 | 195.613 |
| 84.6690219412421 | -6.1 | -1.468 | 193.034 | 193.345 |
| 84.83637039791745 | -5.945 | -1.85 | 191.674 | 191.996 |
| 85.0037188545928 | -5.992 | -2.041 | 191.268 | 191.602 |
| 85.17106731126813 | -6.076 | -2.208 | 190.754 | 191.089 |
| 85.33841576794349 | -6.112 | -2.196 | 190.945 | 191.28 |
| 85.50576422461883 | -6.351 | -2.101 | 192.82 | 193.154 |
| 85.66381554481221 | -6.53 | -2.029 | 193.202 | 193.548 |
| 85.83116400148755 | -6.744 | -1.922 | 193.034 | 193.381 |
| 85.99851245816289 | -6.41 | -2.161 | 191.327 | 191.662 |
| 86.16586091483823 | -6.004 | -2.459 | 189.764 | 190.11 |
| 86.33320937151358 | -5.658 | -2.686 | 189.059 | 189.406 |
| 86.50055782818893 | -5.885 | -2.495 | 190.17 | 190.528 |
| 86.66790628486427 | -6.052 | -2.232 | 191.244 | 191.602 |
| 86.83525474153961 | -5.897 | -1.874 | 190.349 | 190.707 |
| 87.00260319821496 | -5.563 | -1.862 | 188.415 | 188.773 |
| 87.16995165489031 | -5.193 | -2.471 | 185.717 | 186.087 |
| 87.33730011156564 | -5.431 | -2.602 | 185.633 | 186.015 |
| 87.504648568241 | -5.193 | -2.411 | 186.409 | 186.779 |
| 87.67199702491634 | -4.835 | -2.244 | 186.183 | 186.529 |
| 87.83004834510972 | -4.464 | -2.113 | 185.06 | 185.419 |
| 87.99739680178506 | -4.059 | -2.196 | 182.375 | 182.721 |
| 88.1647452584604 | -3.784 | -2.268 | 181.062 | 181.42 |
| 88.33209371513574 | -3.677 | -2.173 | 180.632 | 180.99 |
| 88.49944217181108 | -3.569 | -1.993 | 180.68 | 181.026 |
| 88.66679062848644 | -3.45 | -1.934 | 181.396 | 181.742 |
| 88.83413908516178 | -3.7 | -1.719 | 183.139 | 183.509 |
| 89.00148754183712 | -4.13 | -1.241 | 184.941 | 185.323 |
| 89.16883599851246 | -4.512 | -0.752 | 185.836 | 186.218 |
| 89.33618445518782 | -4.608 | -0.657 | 185.24 | 185.622 |
| 89.50353291186315 | -4.476 | -0.573 | 182.888 | 183.27 |
| 89.6708813685385 | -4.405 | -0.573 | 181.085 | 181.467 |
| 89.83822982521386 | -4.333 | -0.573 | 179.283 | 179.665 |
| 90.00557828188919 | -4.488 | -0.227 | 179.796 | 180.154 |
| 90.16362960208257 | -4.655 | 0.107 | 180.405 | 180.763 |
| 90.3309780587579 | -4.978 | 0.167 | 181.933 | 182.303 |
| 90.49832651543326 | -5.205 | 0.155 | 183.353 | 183.747 |
| 90.66567497210859 | -5.169 | 0.012 | 184.965 | 185.371 |
| 90.83302342878395 | -5.336 | -0.036 | 187.496 | 187.902 |
| 91.00037188545929 | -5.431 | 0.167 | 188.988 | 189.394 |
| 91.16772034213463 | -5.515 | 0.406 | 190.325 | 190.743 |
| 91.33506879880998 | -5.598 | 0.633 | 190.611 | 191.041 |
| 91.50241725548533 | -5.336 | 0.501 | 189.453 | 189.895 |
| 91.66976571216065 | -5.037 | 0.119 | 188.618 | 189.059 |
| 91.83711416883601 | -5.348 | -0.06 | 189.931 | 190.372 |
| 92.00446262551137 | -5.766 | -0.048 | 191.507 | 191.96 |
| 92.1718110821867 | -5.754 | -0.024 | 191.244 | 191.674 |
| 92.33915953886203 | -5.634 | -0.549 | 191.435 | 191.853 |
| 92.49721085905541 | -5.861 | -0.8 | 192.521 | 192.939 |
| 92.66455931573077 | -6.064 | -1.003 | 192.987 | 193.381 |
| 92.83190777240611 | -5.885 | -1.313 | 191.996 | 192.366 |
| 92.99925622908145 | -5.348 | -1.516 | 189.238 | 189.573 |
| 93.1666046857568 | -5.228 | -2.065 | 188.976 | 189.298 |
| 93.33395314243214 | -5.145 | -2.399 | 189.334 | 189.632 |
| 93.50130159910749 | -5.455 | -2.662 | 190.862 | 191.136 |
| 93.66865005578283 | -5.646 | -2.925 | 192.044 | 192.294 |
| 93.83599851245818 | -5.801 | -2.937 | 192.652 | 192.891 |
| 94.00334696913353 | -5.157 | -3.283 | 191.053 | 191.268 |
| 94.17069542580886 | -5.217 | -3.259 | 191.566 | 191.793 |
| 94.3380438824842 | -5.276 | -3.247 | 192.294 | 192.509 |
| 94.50539233915954 | -5.073 | -3.498 | 195.47 | 195.684 |
| 94.66344365935292 | -4.954 | -3.677 | 198.669 | 198.884 |
| 94.83079211602828 | -5.324 | -3.486 | 201.975 | 202.178 |
| 94.99814057270362 | -5.085 | -3.641 | 202.262 | 202.465 |
| 95.16548902937897 | -4.632 | -3.856 | 202.477 | 202.68 |
| 95.33283748605432 | -4.942 | -3.748 | 205.007 | 205.222 |
| 95.50018594272963 | -5.228 | -3.605 | 207.49 | 207.705 |
| 95.66753439940499 | -5.491 | -3.426 | 209.293 | 209.508 |
| 95.83488285608034 | -5.085 | -3.45 | 209.472 | 209.687 |
| 96.00223131275567 | -4.954 | -3.366 | 208.732 | 208.935 |
| 96.16957976943102 | -4.978 | -3.044 | 207.275 | 207.466 |
| 96.33692822610638 | -4.715 | -2.853 | 205.174 | 205.365 |
| 96.50427668278171 | -4.596 | -2.746 | 202.56 | 202.763 |
| 96.67162513945706 | -4.441 | -2.901 | 200.34 | 200.555 |
| 96.8389735961324 | -4.787 | -2.71 | 200.089 | 200.316 |
| 96.99702491632577 | -5.419 | -2.292 | 200.877 | 201.104 |
| 97.16437337300111 | -5.861 | -2.041 | 200.173 | 200.412 |
| 97.33172182967647 | -5.3 | -2.041 | 197.236 | 197.451 |
| 97.49907028635181 | -5.026 | -2.065 | 194.682 | 194.909 |
| 97.66641874302715 | -4.763 | -2.435 | 193.966 | 194.204 |
| 97.8337671997025 | -4.942 | -2.555 | 194.586 | 194.849 |
| 98.00111565637785 | -5.157 | -2.638 | 195.314 | 195.589 |
| 98.16846411305319 | -5.372 | -2.566 | 196.162 | 196.448 |
| 98.33581256972855 | -5.598 | -2.65 | 196.842 | 197.117 |
| 98.50316102640389 | -5.479 | -3.45 | 196.222 | 196.484 |
| 98.67050948307921 | -5.181 | -4.572 | 196.138 | 196.401 |
| 98.83785793975456 | -5.575 | -4.703 | 199.218 | 199.48 |
| 99.0052063964299 | -5.646 | -5.121 | 201.641 | 201.892 |
| 99.17255485310525 | -5.455 | -5.658 | 203.265 | 203.503 |
| 99.33060617329863 | -5.026 | -5.957 | 202.393 | 202.632 |
| 99.49795462997399 | -4.679 | -6.183 | 201.199 | 201.438 |
| 99.66530308664933 | -4.488 | -6.327 | 199.779 | 200.03 |
| 99.83265154332467 | -4.667 | -6.374 | 200.567 | 200.829 |
| 100.0 | -5.181 | -6.076 | 202.095 | 202.357 |